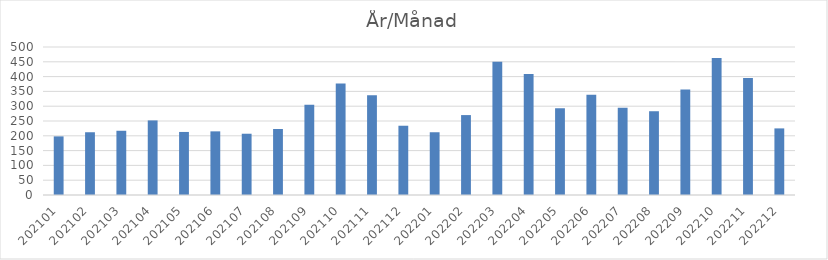
| Category | Summa |
|---|---|
| 202101 | 198 |
| 202102 | 212 |
| 202103 | 217 |
| 202104 | 252 |
| 202105 | 213 |
| 202106 | 215 |
| 202107 | 207 |
| 202108 | 223 |
| 202109 | 305 |
| 202110 | 377 |
| 202111 | 337 |
| 202112 | 234 |
| 202201 | 212 |
| 202202 | 270 |
| 202203 | 450 |
| 202204 | 409 |
| 202205 | 293 |
| 202206 | 339 |
| 202207 | 295 |
| 202208 | 283 |
| 202209 | 356 |
| 202210 | 463 |
| 202211 | 395 |
| 202212 | 225 |